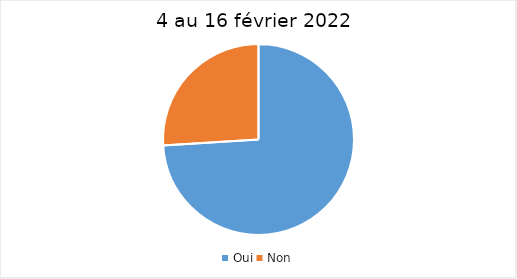
| Category | 4 au 16 février 2022 |
|---|---|
| Oui | 74 |
| Non | 26 |